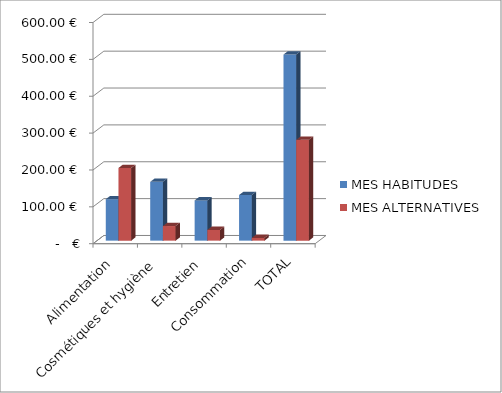
| Category | MES HABITUDES | MES ALTERNATIVES |
|---|---|---|
| Alimentation | 112.45 | 197.167 |
| Cosmétiques et hygiène | 159.503 | 39.636 |
| Entretien | 109.2 | 29.12 |
| Consommation | 123.75 | 7.5 |
| TOTAL | 504.903 | 273.422 |